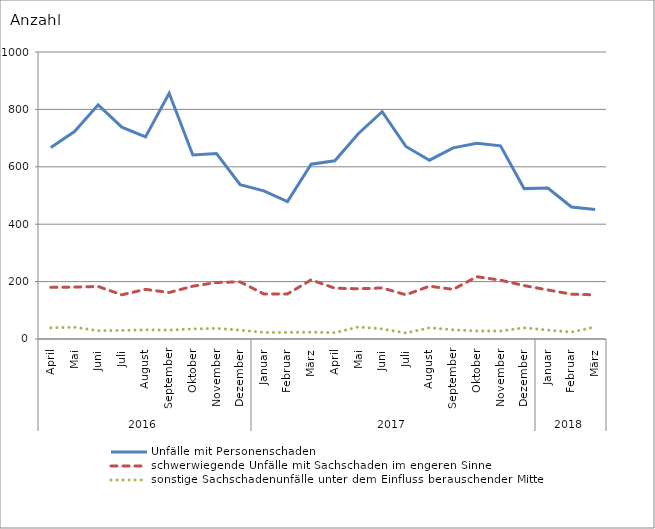
| Category | Unfälle mit Personenschaden | schwerwiegende Unfälle mit Sachschaden im engeren Sinne | sonstige Sachschadenunfälle unter dem Einfluss berauschender Mittel |
|---|---|---|---|
| 0 | 667 | 180 | 39 |
| 1 | 723 | 181 | 41 |
| 2 | 816 | 183 | 29 |
| 3 | 738 | 154 | 30 |
| 4 | 704 | 173 | 32 |
| 5 | 856 | 162 | 31 |
| 6 | 641 | 184 | 35 |
| 7 | 646 | 197 | 37 |
| 8 | 538 | 199 | 31 |
| 9 | 516 | 157 | 23 |
| 10 | 479 | 157 | 23 |
| 11 | 609 | 206 | 24 |
| 12 | 621 | 177 | 22 |
| 13 | 716 | 175 | 42 |
| 14 | 792 | 178 | 35 |
| 15 | 671 | 154 | 21 |
| 16 | 623 | 184 | 39 |
| 17 | 666 | 173 | 32 |
| 18 | 682 | 217 | 28 |
| 19 | 673 | 205 | 28 |
| 20 | 524 | 186 | 39 |
| 21 | 526 | 171 | 31 |
| 22 | 460 | 156 | 24 |
| 23 | 451 | 154 | 42 |